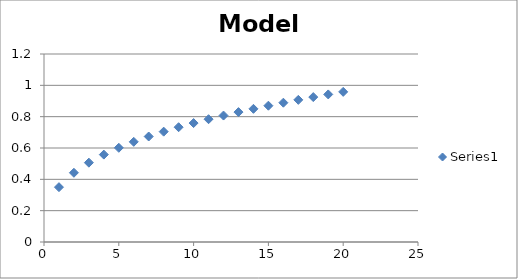
| Category | Series 0 |
|---|---|
| 1.0 | 0.35 |
| 2.0 | 0.442 |
| 3.0 | 0.506 |
| 4.0 | 0.558 |
| 5.0 | 0.601 |
| 6.0 | 0.639 |
| 7.0 | 0.673 |
| 8.0 | 0.704 |
| 9.0 | 0.733 |
| 10.0 | 0.759 |
| 11.0 | 0.784 |
| 12.0 | 0.807 |
| 13.0 | 0.829 |
| 14.0 | 0.85 |
| 15.0 | 0.87 |
| 16.0 | 0.889 |
| 17.0 | 0.907 |
| 18.0 | 0.925 |
| 19.0 | 0.942 |
| 20.0 | 0.958 |